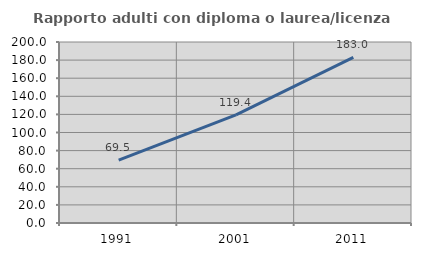
| Category | Rapporto adulti con diploma o laurea/licenza media  |
|---|---|
| 1991.0 | 69.53 |
| 2001.0 | 119.385 |
| 2011.0 | 182.985 |